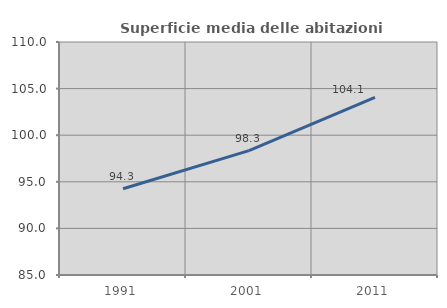
| Category | Superficie media delle abitazioni occupate |
|---|---|
| 1991.0 | 94.254 |
| 2001.0 | 98.347 |
| 2011.0 | 104.063 |